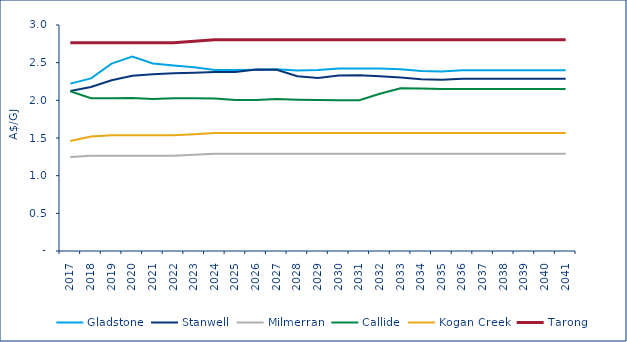
| Category | Gladstone | Stanwell | Milmerran | Callide | Kogan Creek | Tarong |
|---|---|---|---|---|---|---|
| 2017.0 | 2.222 | 2.124 | 1.249 | 2.12 | 1.459 | 2.766 |
| 2018.0 | 2.291 | 2.176 | 1.265 | 2.027 | 1.521 | 2.766 |
| 2019.0 | 2.487 | 2.266 | 1.265 | 2.029 | 1.535 | 2.766 |
| 2020.0 | 2.581 | 2.326 | 1.265 | 2.03 | 1.535 | 2.766 |
| 2021.0 | 2.488 | 2.345 | 1.265 | 2.018 | 1.535 | 2.766 |
| 2022.0 | 2.461 | 2.358 | 1.265 | 2.027 | 1.535 | 2.766 |
| 2023.0 | 2.439 | 2.367 | 1.278 | 2.028 | 1.551 | 2.784 |
| 2024.0 | 2.404 | 2.375 | 1.292 | 2.025 | 1.567 | 2.803 |
| 2025.0 | 2.404 | 2.376 | 1.292 | 2.006 | 1.567 | 2.803 |
| 2026.0 | 2.406 | 2.408 | 1.292 | 2.005 | 1.567 | 2.803 |
| 2027.0 | 2.411 | 2.405 | 1.292 | 2.018 | 1.567 | 2.803 |
| 2028.0 | 2.395 | 2.321 | 1.292 | 2.008 | 1.567 | 2.803 |
| 2029.0 | 2.403 | 2.298 | 1.292 | 2.004 | 1.567 | 2.803 |
| 2030.0 | 2.424 | 2.329 | 1.292 | 2 | 1.567 | 2.803 |
| 2031.0 | 2.421 | 2.334 | 1.292 | 2.001 | 1.567 | 2.803 |
| 2032.0 | 2.422 | 2.32 | 1.292 | 2.087 | 1.567 | 2.803 |
| 2033.0 | 2.414 | 2.304 | 1.292 | 2.161 | 1.567 | 2.803 |
| 2034.0 | 2.388 | 2.279 | 1.292 | 2.158 | 1.567 | 2.803 |
| 2035.0 | 2.382 | 2.272 | 1.292 | 2.152 | 1.567 | 2.803 |
| 2036.0 | 2.399 | 2.288 | 1.292 | 2.149 | 1.567 | 2.803 |
| 2037.0 | 2.399 | 2.288 | 1.292 | 2.149 | 1.567 | 2.803 |
| 2038.0 | 2.399 | 2.288 | 1.292 | 2.149 | 1.567 | 2.803 |
| 2039.0 | 2.399 | 2.288 | 1.292 | 2.149 | 1.567 | 2.803 |
| 2040.0 | 2.399 | 2.288 | 1.292 | 2.149 | 1.567 | 2.803 |
| 2041.0 | 2.399 | 2.288 | 1.292 | 2.149 | 1.567 | 2.803 |